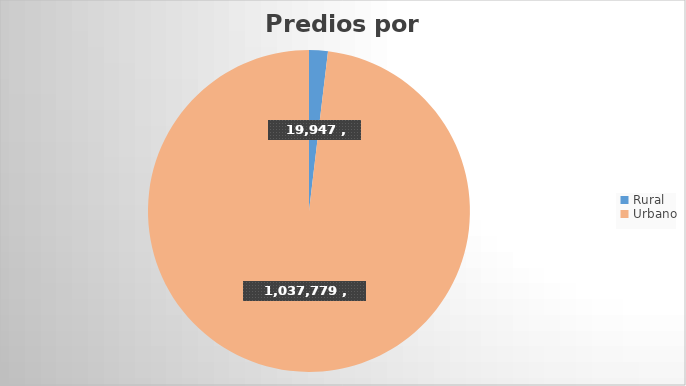
| Category | Predios |
|---|---|
| Rural | 19947 |
| Urbano | 1037779 |